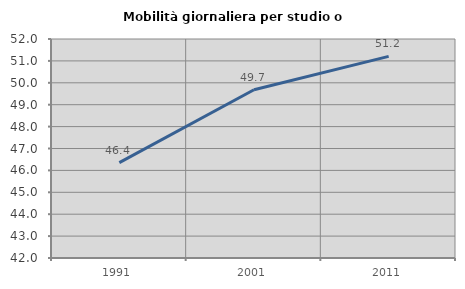
| Category | Mobilità giornaliera per studio o lavoro |
|---|---|
| 1991.0 | 46.358 |
| 2001.0 | 49.684 |
| 2011.0 | 51.208 |